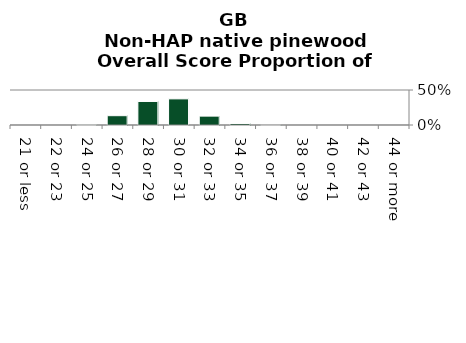
| Category | Non-HAP native pinewood |
|---|---|
| 21 or less | 0 |
| 22 or 23 | 0 |
| 24 or 25 | 0.009 |
| 26 or 27 | 0.133 |
| 28 or 29 | 0.336 |
| 30 or 31 | 0.373 |
| 32 or 33 | 0.127 |
| 34 or 35 | 0.022 |
| 36 or 37 | 0 |
| 38 or 39 | 0 |
| 40 or 41 | 0 |
| 42 or 43 | 0 |
| 44 or more | 0 |